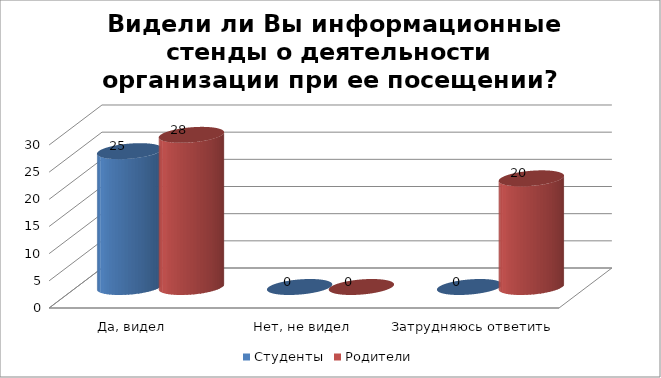
| Category | Студенты | Родители |
|---|---|---|
| Да, видел | 25 | 28 |
| Нет, не видел | 0 | 0 |
| Затрудняюсь ответить | 0 | 20 |